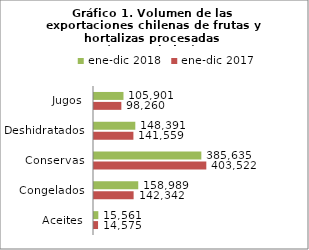
| Category | ene-dic 2017 | ene-dic 2018 |
|---|---|---|
| Aceites | 14574585.743 | 15561164.725 |
| Congelados | 142341687.412 | 158988981.725 |
| Conservas | 403522381.755 | 385635390.468 |
| Deshidratados | 141559034.194 | 148390878.557 |
| Jugos | 98259698.12 | 105901288.132 |